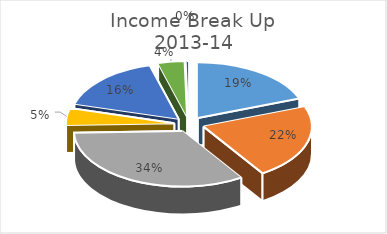
| Category | Income Break Up 
2013-14 |
|---|---|
| FCO Grant | 0.193 |
| Teaching | 0.216 |
| Examination | 0.337 |
| Partnership | 0.049 |
| Contracts | 0.163 |
| Other Paid Services | 0.04 |
| Bank Interest | 0.004 |